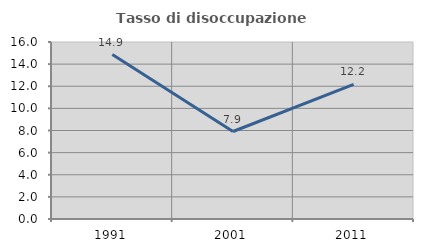
| Category | Tasso di disoccupazione giovanile  |
|---|---|
| 1991.0 | 14.865 |
| 2001.0 | 7.91 |
| 2011.0 | 12.162 |